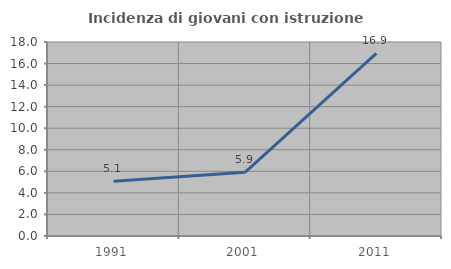
| Category | Incidenza di giovani con istruzione universitaria |
|---|---|
| 1991.0 | 5.076 |
| 2001.0 | 5.911 |
| 2011.0 | 16.94 |